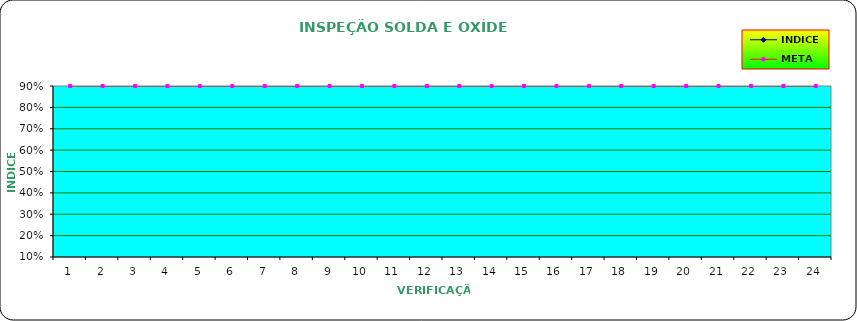
| Category | INDICE | META |
|---|---|---|
| 0 |  | 0.9 |
| 1 |  | 0.9 |
| 2 |  | 0.9 |
| 3 |  | 0.9 |
| 4 |  | 0.9 |
| 5 |  | 0.9 |
| 6 |  | 0.9 |
| 7 |  | 0.9 |
| 8 |  | 0.9 |
| 9 |  | 0.9 |
| 10 |  | 0.9 |
| 11 |  | 0.9 |
| 12 |  | 0.9 |
| 13 |  | 0.9 |
| 14 |  | 0.9 |
| 15 |  | 0.9 |
| 16 |  | 0.9 |
| 17 |  | 0.9 |
| 18 |  | 0.9 |
| 19 |  | 0.9 |
| 20 |  | 0.9 |
| 21 |  | 0.9 |
| 22 |  | 0.9 |
| 23 |  | 0.9 |